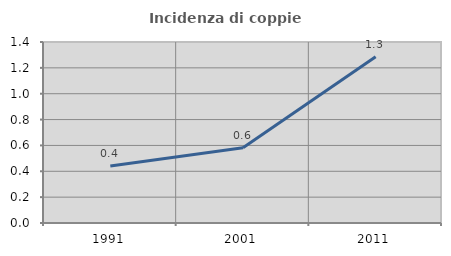
| Category | Incidenza di coppie miste |
|---|---|
| 1991.0 | 0.441 |
| 2001.0 | 0.583 |
| 2011.0 | 1.286 |